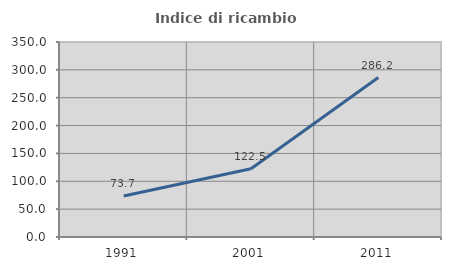
| Category | Indice di ricambio occupazionale  |
|---|---|
| 1991.0 | 73.697 |
| 2001.0 | 122.498 |
| 2011.0 | 286.207 |